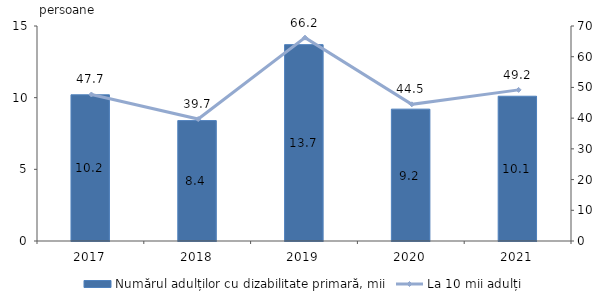
| Category | Numărul adulților cu dizabilitate primară, mii |
|---|---|
| 2017.0 | 10.2 |
| 2018.0 | 8.4 |
| 2019.0 | 13.7 |
| 2020.0 | 9.2 |
| 2021.0 | 10.1 |